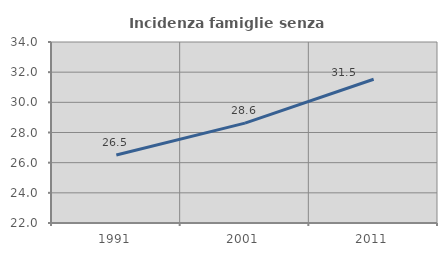
| Category | Incidenza famiglie senza nuclei |
|---|---|
| 1991.0 | 26.503 |
| 2001.0 | 28.621 |
| 2011.0 | 31.528 |